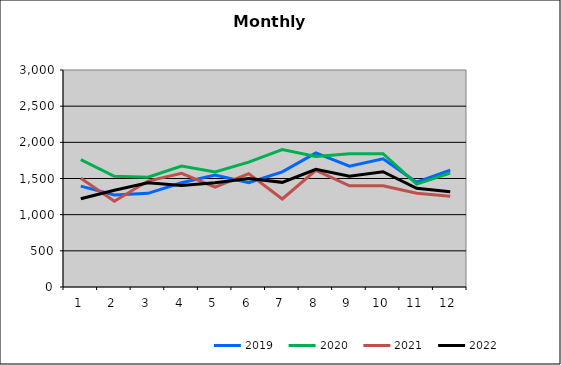
| Category | 2019 | 2020 | 2021 | 2022 |
|---|---|---|---|---|
| 0 | 1394.576 | 1762.064 | 1503.68 | 1219.945 |
| 1 | 1272.617 | 1530.829 | 1186.293 | 1336.681 |
| 2 | 1295.231 | 1518.163 | 1464.516 | 1440.294 |
| 3 | 1441.267 | 1671.58 | 1572.076 | 1402.544 |
| 4 | 1548.691 | 1589.128 | 1381.3 | 1441.429 |
| 5 | 1443.46 | 1725.706 | 1567.527 | 1499.211 |
| 6 | 1591.615 | 1898.774 | 1216.971 | 1446.662 |
| 7 | 1854.799 | 1803.166 | 1613.137 | 1627.894 |
| 8 | 1671.028 | 1843.578 | 1398.947 | 1532.503 |
| 9 | 1771.378 | 1843.468 | 1399.401 | 1593.004 |
| 10 | 1448.517 | 1422.612 | 1297.013 | 1365.513 |
| 11 | 1616.657 | 1574.354 | 1256.018 | 1317.127 |